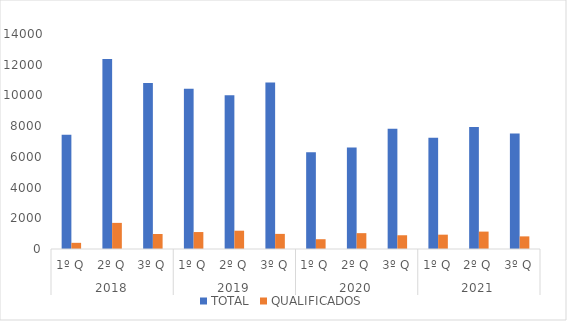
| Category | TOTAL | QUALIFICADOS |
|---|---|---|
| 0 | 7443 | 402 |
| 1 | 12365 | 1701 |
| 2 | 10811 | 977 |
| 3 | 10439 | 1104 |
| 4 | 10013 | 1192 |
| 5 | 10845 | 984 |
| 6 | 6295 | 637 |
| 7 | 6612 | 1032 |
| 8 | 7823 | 895 |
| 9 | 7242 | 933 |
| 10 | 7949 | 1133 |
| 11 | 7528 | 822 |